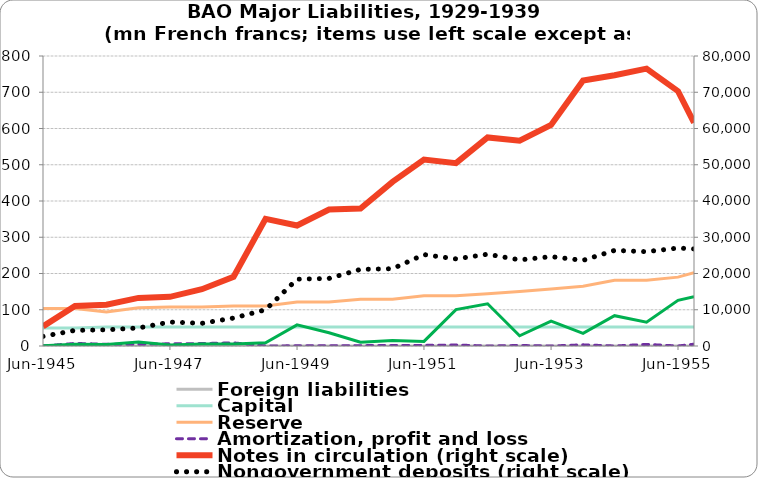
| Category | Foreign liabilities | Capital  | Reserve | Amortization, profit and loss |
|---|---|---|---|---|
| 1945-06-30 | 0 | 50 | 103.272 | 0 |
| 1945-12-31 | 0 | 50 | 103.272 | 7.06 |
| 1946-06-30 | 0 | 52.63 | 93.493 | 4.837 |
| 1946-12-31 | 0 | 52.63 | 105.398 | 4.837 |
| 1947-06-30 | 0 | 52.63 | 107.755 | 6.069 |
| 1947-12-31 | 0 | 52.63 | 107.755 | 6.676 |
| 1948-06-30 | 0 | 52.63 | 110.565 | 8.531 |
| 1948-12-31 | 0 | 52.63 | 110.565 | 0.248 |
| 1949-06-30 | 0 | 52.63 | 121.529 | 0.388 |
| 1949-12-31 | 0 | 52.63 | 121.529 | 0.616 |
| 1950-06-30 | 0 | 52.63 | 128.98 | 1.012 |
| 1950-12-31 | 0 | 52.63 | 128.98 | 1.289 |
| 1951-06-30 | 0 | 52.63 | 138.445 | 1.768 |
| 1951-12-31 | 0 | 52.63 | 138.445 | 2.679 |
| 1952-06-30 | 0 | 52.63 | 143.933 | 0 |
| 1952-12-31 | 0 | 52.63 | 150.427 | 1.378 |
| 1953-06-30 | 0 | 52.63 | 157.425 | 0 |
| 1953-12-31 | 0 | 52.63 | 164.926 | 3.196 |
| 1954-06-30 | 0 | 52.63 | 181.439 | 0 |
| 1954-12-31 | 0 | 52.63 | 181.439 | 4.461 |
| 1955-06-30 | 0 | 52.63 | 189.947 | 0 |
| 1955-09-30 | 0 | 52.63 | 201.962 | 4.981 |